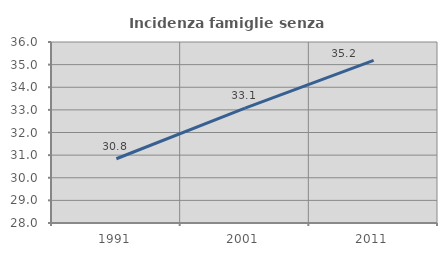
| Category | Incidenza famiglie senza nuclei |
|---|---|
| 1991.0 | 30.84 |
| 2001.0 | 33.074 |
| 2011.0 | 35.187 |